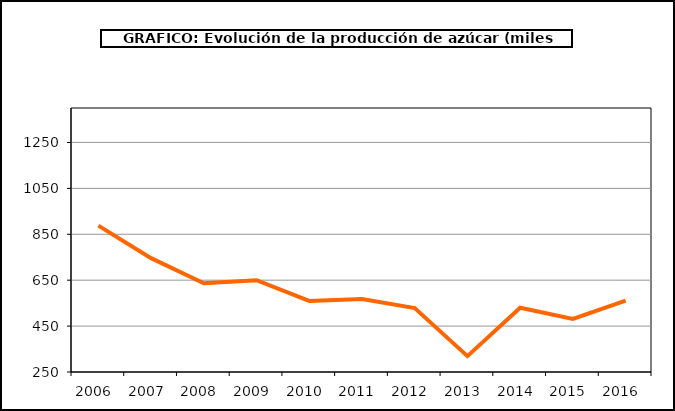
| Category | Producción |
|---|---|
| 2006.0 | 887.794 |
| 2007.0 | 745.869 |
| 2008.0 | 636.459 |
| 2009.0 | 649.935 |
| 2010.0 | 559.795 |
| 2011.0 | 567.722 |
| 2012.0 | 528.414 |
| 2013.0 | 319.237 |
| 2014.0 | 529.794 |
| 2015.0 | 481.569 |
| 2016.0 | 560.897 |